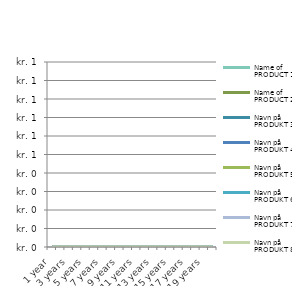
| Category | Name of PRODUCT 1 | Name of PRODUCT 2 | Navn på PRODUKT 3 | Navn på PRODUKT 4 | Navn på PRODUKT 5 | Navn på PRODUKT 6 | Navn på PRODUKT 7 | Navn på PRODUKT 8 |
|---|---|---|---|---|---|---|---|---|
| 1 year | 0 | 0 | 0 | 0 | 0 | 0 | 0 | 0 |
| 2 years | 0 | 0 | 0 | 0 | 0 | 0 | 0 | 0 |
| 3 years | 0 | 0 | 0 | 0 | 0 | 0 | 0 | 0 |
| 4 years | 0 | 0 | 0 | 0 | 0 | 0 | 0 | 0 |
| 5 years | 0 | 0 | 0 | 0 | 0 | 0 | 0 | 0 |
| 6 years | 0 | 0 | 0 | 0 | 0 | 0 | 0 | 0 |
| 7 years | 0 | 0 | 0 | 0 | 0 | 0 | 0 | 0 |
| 8 years | 0 | 0 | 0 | 0 | 0 | 0 | 0 | 0 |
| 9 years | 0 | 0 | 0 | 0 | 0 | 0 | 0 | 0 |
| 10 years | 0 | 0 | 0 | 0 | 0 | 0 | 0 | 0 |
| 11 years | 0 | 0 | 0 | 0 | 0 | 0 | 0 | 0 |
| 12 years | 0 | 0 | 0 | 0 | 0 | 0 | 0 | 0 |
| 13 years | 0 | 0 | 0 | 0 | 0 | 0 | 0 | 0 |
| 14 years | 0 | 0 | 0 | 0 | 0 | 0 | 0 | 0 |
| 15 years | 0 | 0 | 0 | 0 | 0 | 0 | 0 | 0 |
| 16 years | 0 | 0 | 0 | 0 | 0 | 0 | 0 | 0 |
| 17 years | 0 | 0 | 0 | 0 | 0 | 0 | 0 | 0 |
| 18 years | 0 | 0 | 0 | 0 | 0 | 0 | 0 | 0 |
| 19 years | 0 | 0 | 0 | 0 | 0 | 0 | 0 | 0 |
| 20 years | 0 | 0 | 0 | 0 | 0 | 0 | 0 | 0 |